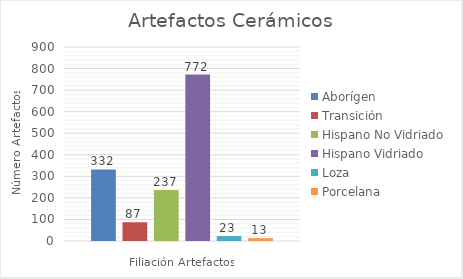
| Category | Aborígen | Transición | Hispano No Vidriado | Hispano Vidriado | Loza | Porcelana |
|---|---|---|---|---|---|---|
| 0 | 332 | 87 | 237 | 772 | 23 | 13 |